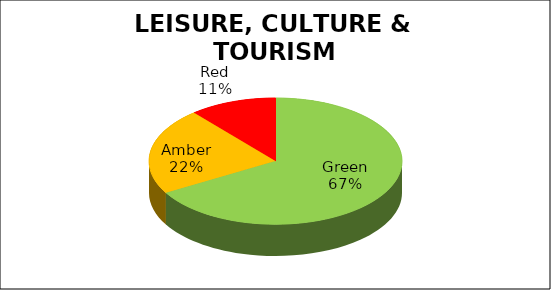
| Category | Q1 |
|---|---|
| Green | 0.667 |
| Amber | 0.222 |
| Red | 0.111 |